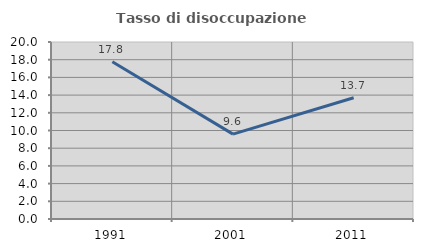
| Category | Tasso di disoccupazione giovanile  |
|---|---|
| 1991.0 | 17.761 |
| 2001.0 | 9.589 |
| 2011.0 | 13.699 |